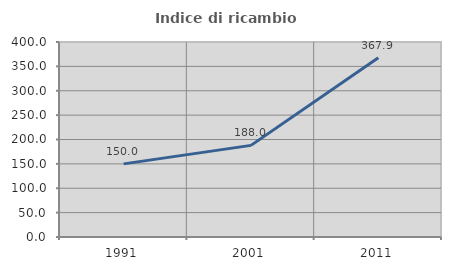
| Category | Indice di ricambio occupazionale  |
|---|---|
| 1991.0 | 150 |
| 2001.0 | 187.963 |
| 2011.0 | 367.857 |